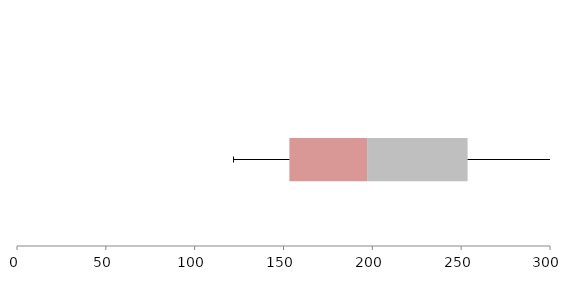
| Category | Series 1 | Series 2 | Series 3 |
|---|---|---|---|
| 0 | 153.322 | 43.715 | 56.593 |